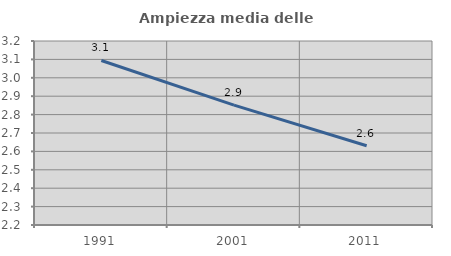
| Category | Ampiezza media delle famiglie |
|---|---|
| 1991.0 | 3.094 |
| 2001.0 | 2.852 |
| 2011.0 | 2.631 |